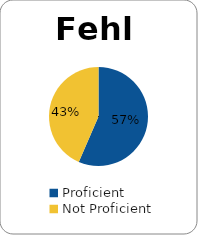
| Category | Series 0 |
|---|---|
| Proficient | 0.565 |
| Not Proficient | 0.435 |